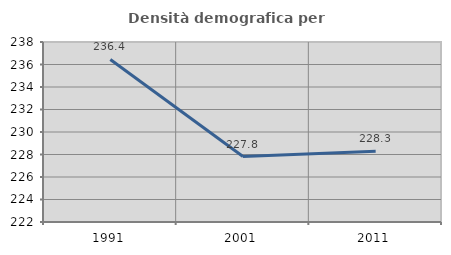
| Category | Densità demografica |
|---|---|
| 1991.0 | 236.448 |
| 2001.0 | 227.815 |
| 2011.0 | 228.285 |